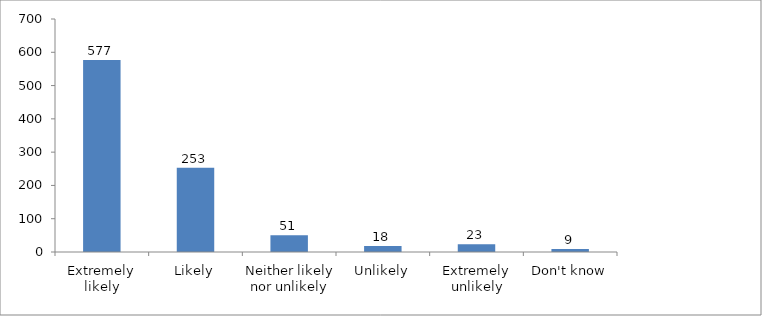
| Category | Series 0 |
|---|---|
| Extremely likely | 577 |
| Likely | 253 |
| Neither likely nor unlikely | 50 |
| Unlikely | 18 |
| Extremely unlikely | 23 |
| Don't know | 9 |